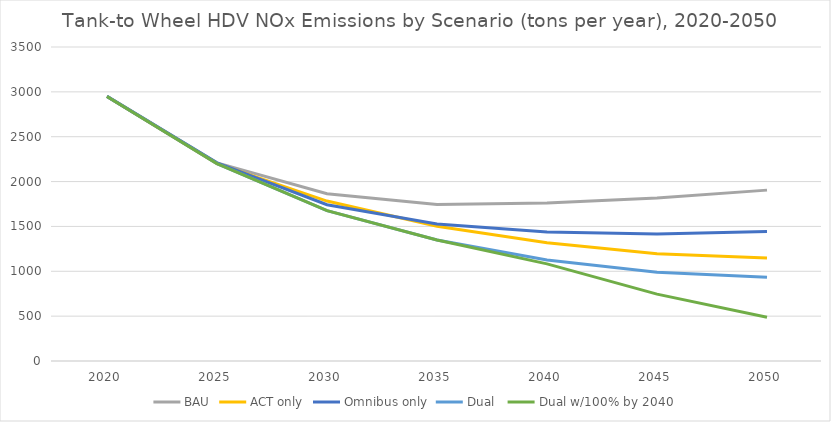
| Category | BAU | ACT only | Omnibus only | Dual  | Dual w/100% by 2040 |
|---|---|---|---|---|---|
| 2020.0 | 2949.268 | 2949.268 | 2949.268 | 2949.268 | 2949.268 |
| 2025.0 | 2208.899 | 2199.933 | 2208.899 | 2199.933 | 2199.933 |
| 2030.0 | 1865.36 | 1782.575 | 1741.518 | 1676.323 | 1676.323 |
| 2035.0 | 1743.97 | 1502.573 | 1525.954 | 1348.429 | 1348.429 |
| 2040.0 | 1761.266 | 1317.497 | 1438.289 | 1125.324 | 1082.915 |
| 2045.0 | 1816.31 | 1195.28 | 1416.344 | 990.466 | 745.486 |
| 2050.0 | 1904.673 | 1147.178 | 1443.043 | 933.234 | 487.417 |